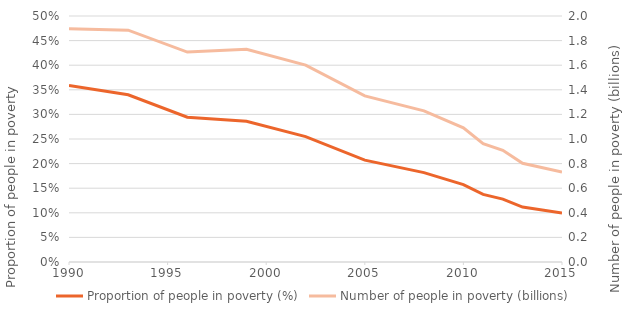
| Category | Proportion of people in poverty (%) |
|---|---|
| 1990.0 | 0.359 |
| 1993.0 | 0.34 |
| 1996.0 | 0.294 |
| 1999.0 | 0.286 |
| 2002.0 | 0.255 |
| 2005.0 | 0.207 |
| 2008.0 | 0.182 |
| 2010.0 | 0.157 |
| 2011.0 | 0.137 |
| 2012.0 | 0.128 |
| 2013.0 | 0.112 |
| 2015.0 | 0.099 |